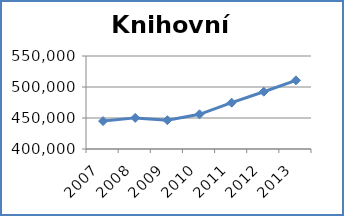
| Category | Knihovní fond |
|---|---|
| 2007.0 | 445012 |
| 2008.0 | 450190 |
| 2009.0 | 446493 |
| 2010.0 | 455984 |
| 2011.0 | 474701 |
| 2012.0 | 492398 |
| 2013.0 | 510749 |